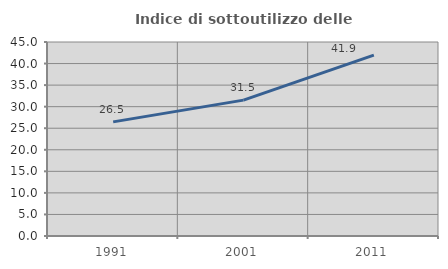
| Category | Indice di sottoutilizzo delle abitazioni  |
|---|---|
| 1991.0 | 26.471 |
| 2001.0 | 31.519 |
| 2011.0 | 41.946 |